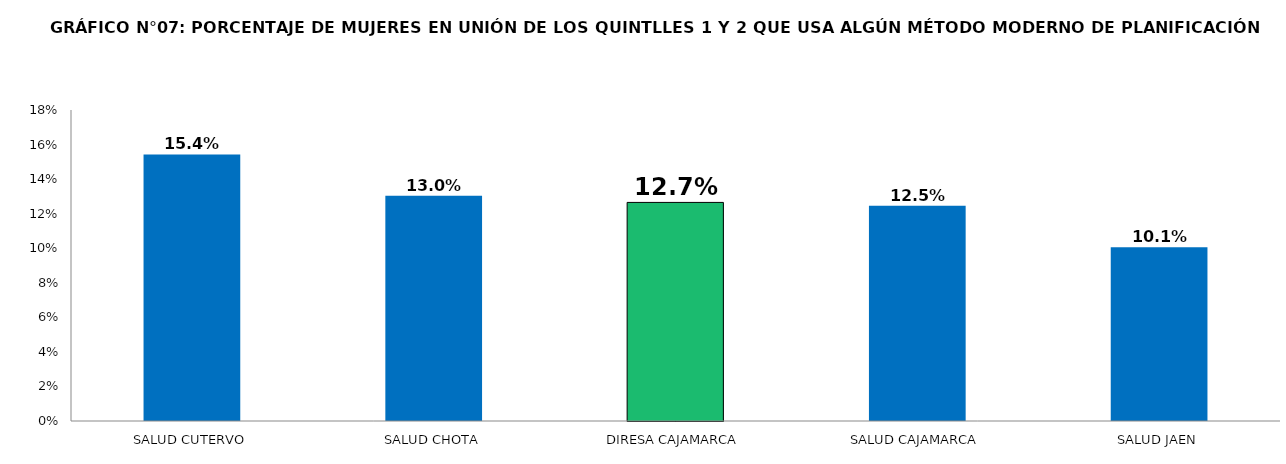
| Category | % PAREJAS PROTEGIDAS PPFF 
(QUINTIL 1 Y 2) |
|---|---|
| SALUD CUTERVO | 0.154 |
| SALUD CHOTA | 0.13 |
| DIRESA CAJAMARCA | 0.127 |
| SALUD CAJAMARCA | 0.125 |
| SALUD JAEN | 0.101 |